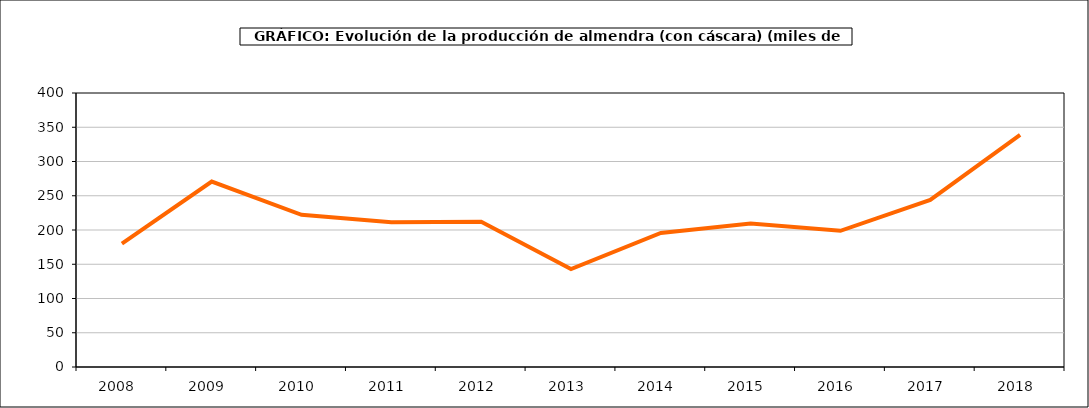
| Category | producción almendro |
|---|---|
| 2008.0 | 180.103 |
| 2009.0 | 270.686 |
| 2010.0 | 222.217 |
| 2011.0 | 211.179 |
| 2012.0 | 212.063 |
| 2013.0 | 143.081 |
| 2014.0 | 195.699 |
| 2015.0 | 209.443 |
| 2016.0 | 198.767 |
| 2017.0 | 243.876 |
| 2018.0 | 339.033 |